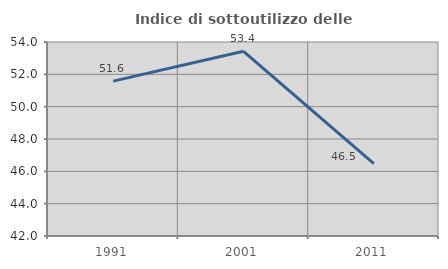
| Category | Indice di sottoutilizzo delle abitazioni  |
|---|---|
| 1991.0 | 51.579 |
| 2001.0 | 53.425 |
| 2011.0 | 46.479 |